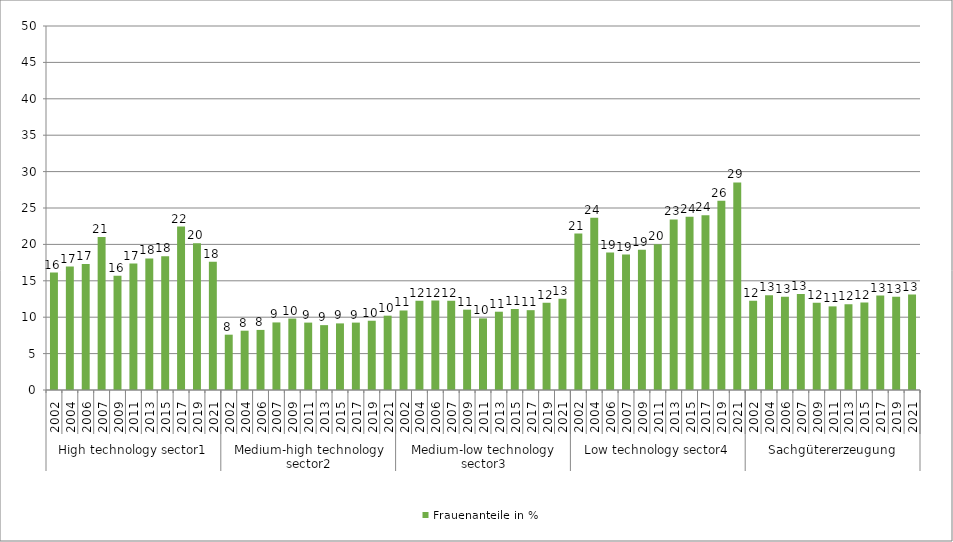
| Category | Frauenanteile in % |
|---|---|
| 0 | 16.124 |
| 1 | 16.961 |
| 2 | 17.301 |
| 3 | 21.029 |
| 4 | 15.708 |
| 5 | 17.375 |
| 6 | 18.078 |
| 7 | 18.359 |
| 8 | 22.452 |
| 9 | 20.158 |
| 10 | 17.616 |
| 11 | 7.599 |
| 12 | 8.147 |
| 13 | 8.253 |
| 14 | 9.282 |
| 15 | 9.815 |
| 16 | 9.258 |
| 17 | 8.91 |
| 18 | 9.15 |
| 19 | 9.258 |
| 20 | 9.515 |
| 21 | 10.209 |
| 22 | 10.922 |
| 23 | 12.252 |
| 24 | 12.282 |
| 25 | 12.26 |
| 26 | 11.034 |
| 27 | 9.839 |
| 28 | 10.753 |
| 29 | 11.128 |
| 30 | 10.965 |
| 31 | 11.978 |
| 32 | 12.529 |
| 33 | 21.488 |
| 34 | 23.671 |
| 35 | 18.872 |
| 36 | 18.598 |
| 37 | 19.279 |
| 38 | 20.024 |
| 39 | 23.426 |
| 40 | 23.793 |
| 41 | 24.011 |
| 42 | 25.982 |
| 43 | 28.516 |
| 44 | 12.251 |
| 45 | 13.025 |
| 46 | 12.823 |
| 47 | 13.202 |
| 48 | 11.993 |
| 49 | 11.487 |
| 50 | 11.768 |
| 51 | 12.006 |
| 52 | 12.981 |
| 53 | 12.798 |
| 54 | 13.111 |